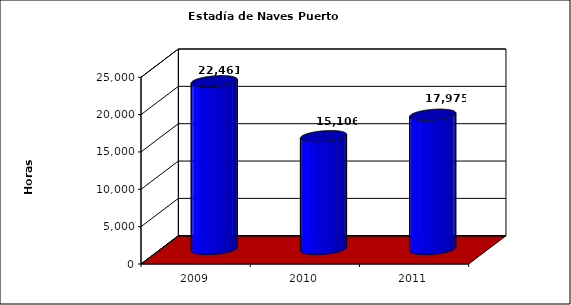
| Category | Series 0 |
|---|---|
| 2009.0 | 22461 |
| 2010.0 | 15106 |
| 2011.0 | 17975 |